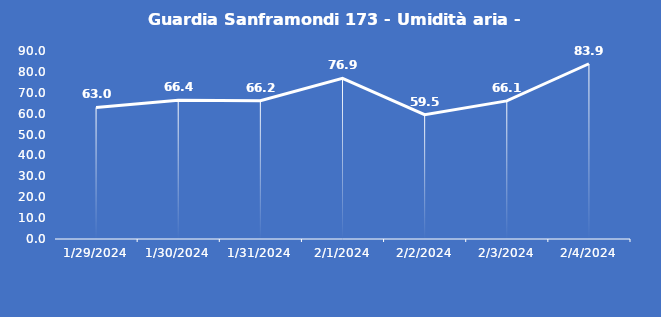
| Category | Guardia Sanframondi 173 - Umidità aria - Grezzo (%) |
|---|---|
| 1/29/24 | 63 |
| 1/30/24 | 66.4 |
| 1/31/24 | 66.2 |
| 2/1/24 | 76.9 |
| 2/2/24 | 59.5 |
| 2/3/24 | 66.1 |
| 2/4/24 | 83.9 |